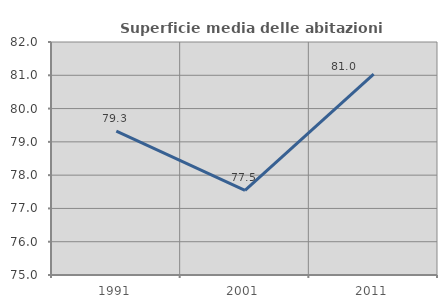
| Category | Superficie media delle abitazioni occupate |
|---|---|
| 1991.0 | 79.32 |
| 2001.0 | 77.542 |
| 2011.0 | 81.033 |